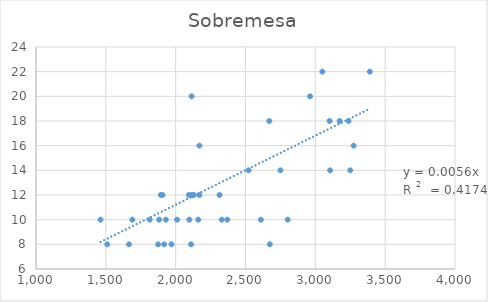
| Category | Sobremesa |
|---|---|
| 1894.0 | 12 |
| 2802.0 | 10 |
| 2750.0 | 14 |
| 2110.0 | 8 |
| 1970.0 | 8 |
| 2098.0 | 10 |
| 1930.0 | 10 |
| 2130.0 | 12 |
| 2330.0 | 10 |
| 2010.0 | 10 |
| 2674.0 | 8 |
| 2370.0 | 10 |
| 1906.0 | 12 |
| 2114.0 | 20 |
| 2910.0 | 26 |
| 1510.0 | 8 |
| 1874.0 | 8 |
| 2094.0 | 12 |
| 2670.0 | 18 |
| 3390.0 | 22 |
| 1882.0 | 10 |
| 3050.0 | 22 |
| 3174.0 | 18 |
| 2114.0 | 12 |
| 1690.0 | 10 |
| 1918.0 | 8 |
| 3238.0 | 18 |
| 1814.0 | 10 |
| 2610.0 | 10 |
| 1462.0 | 10 |
| 3106.0 | 14 |
| 2522.0 | 14 |
| 1666.0 | 8 |
| 3274.0 | 16 |
| 3102.0 | 18 |
| 3210.0 | 28 |
| 2170.0 | 16 |
| 2962.0 | 20 |
| 2170.0 | 12 |
| 3250.0 | 14 |
| 2314.0 | 12 |
| 2162.0 | 10 |